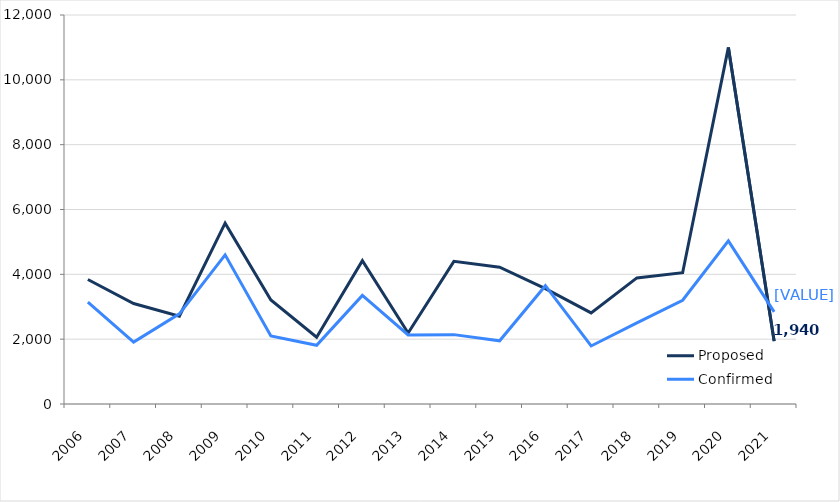
| Category | Proposed | Confirmed |
|---|---|---|
| 2006 | 3840 | 3140 |
| 2007 | 3100 | 1910 |
| 2008 | 2710 | 2780 |
| 2009 | 5580 | 4600 |
| 2010 | 3210 | 2100 |
| 2011 | 2060 | 1810 |
| 2012 | 4420 | 3350 |
| 2013 | 2190 | 2130 |
| 2014 | 4400 | 2140 |
| 2015 | 4220 | 1950 |
| 2016 | 3560 | 3650 |
| 2017 | 2810 | 1790 |
| 2018 | 3890 | 2500 |
| 2019 | 4050 | 3200 |
| 2020 | 11000 | 5030 |
| 2021 | 1940 | 2840 |